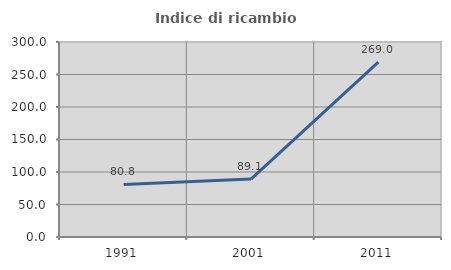
| Category | Indice di ricambio occupazionale  |
|---|---|
| 1991.0 | 80.795 |
| 2001.0 | 89.13 |
| 2011.0 | 268.966 |